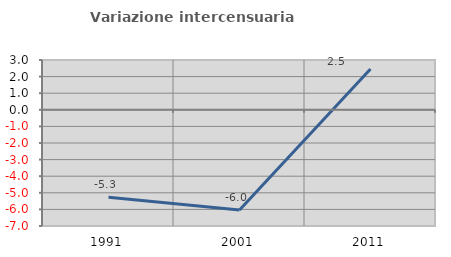
| Category | Variazione intercensuaria annua |
|---|---|
| 1991.0 | -5.273 |
| 2001.0 | -6.037 |
| 2011.0 | 2.462 |